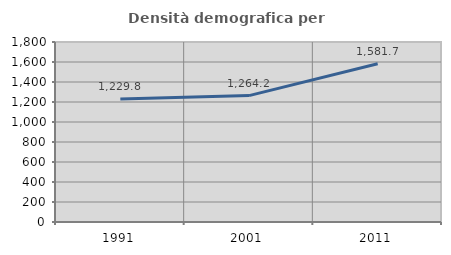
| Category | Densità demografica |
|---|---|
| 1991.0 | 1229.774 |
| 2001.0 | 1264.168 |
| 2011.0 | 1581.724 |